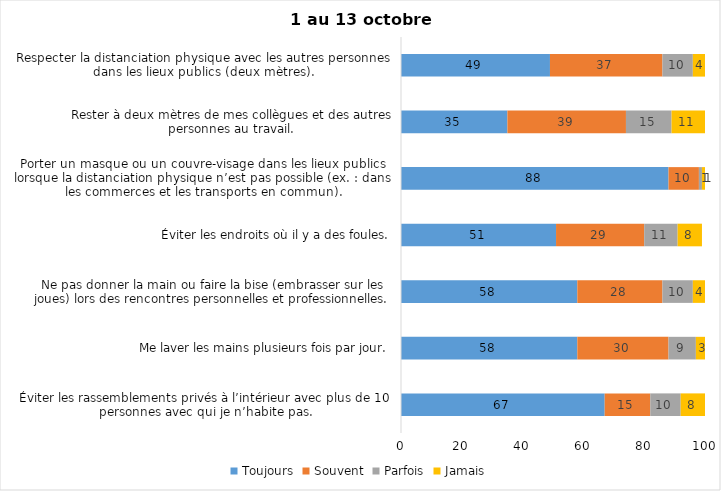
| Category | Toujours | Souvent | Parfois | Jamais |
|---|---|---|---|---|
| Éviter les rassemblements privés à l’intérieur avec plus de 10 personnes avec qui je n’habite pas. | 67 | 15 | 10 | 8 |
| Me laver les mains plusieurs fois par jour. | 58 | 30 | 9 | 3 |
| Ne pas donner la main ou faire la bise (embrasser sur les joues) lors des rencontres personnelles et professionnelles. | 58 | 28 | 10 | 4 |
| Éviter les endroits où il y a des foules. | 51 | 29 | 11 | 8 |
| Porter un masque ou un couvre-visage dans les lieux publics lorsque la distanciation physique n’est pas possible (ex. : dans les commerces et les transports en commun). | 88 | 10 | 1 | 1 |
| Rester à deux mètres de mes collègues et des autres personnes au travail. | 35 | 39 | 15 | 11 |
| Respecter la distanciation physique avec les autres personnes dans les lieux publics (deux mètres). | 49 | 37 | 10 | 4 |